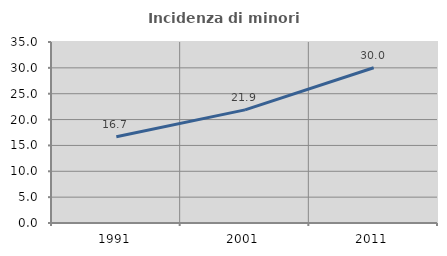
| Category | Incidenza di minori stranieri |
|---|---|
| 1991.0 | 16.667 |
| 2001.0 | 21.875 |
| 2011.0 | 30.029 |